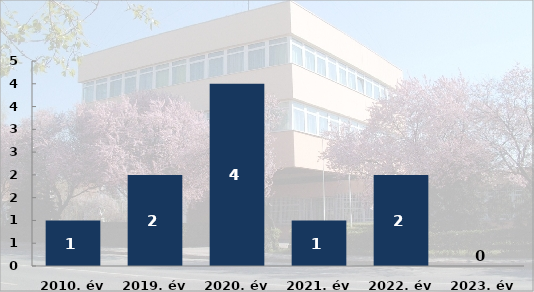
| Category | Ittasan okozott személysérüléses közúti közlekedési balesetek száma |
|---|---|
| 2010. év | 1 |
| 2019. év | 2 |
| 2020. év | 4 |
| 2021. év | 1 |
| 2022. év | 2 |
| 2023. év | 0 |